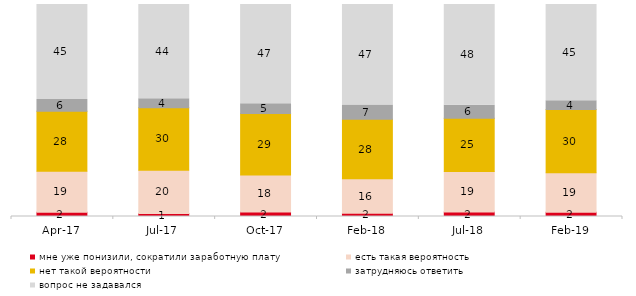
| Category | мне уже понизили, сократили заработную плату | есть такая вероятность | нет такой вероятности | затрудняюсь ответить | вопрос не задавался |
|---|---|---|---|---|---|
| 2017-04-01 | 2 | 19.4 | 28.25 | 5.55 | 44.8 |
| 2017-07-01 | 1.4 | 20.45 | 29.5 | 4.2 | 44.45 |
| 2017-10-01 | 2.1 | 17.5 | 29 | 4.6 | 46.8 |
| 2018-02-01 | 1.5 | 16.25 | 28.15 | 6.7 | 47.4 |
| 2018-07-01 | 2.1 | 19.1 | 25.1 | 6.15 | 47.55 |
| 2019-02-01 | 2.05 | 18.55 | 29.85 | 4.2 | 45.35 |